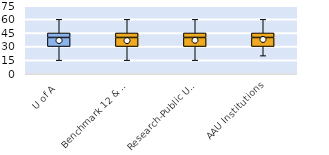
| Category | 25th | 50th | 75th |
|---|---|---|---|
| U of A | 30 | 10 | 5 |
| Benchmark 12 & SEC | 30 | 10 | 5 |
| Research-Public Univ | 30 | 10 | 5 |
| AAU Institutions | 30 | 10 | 5 |